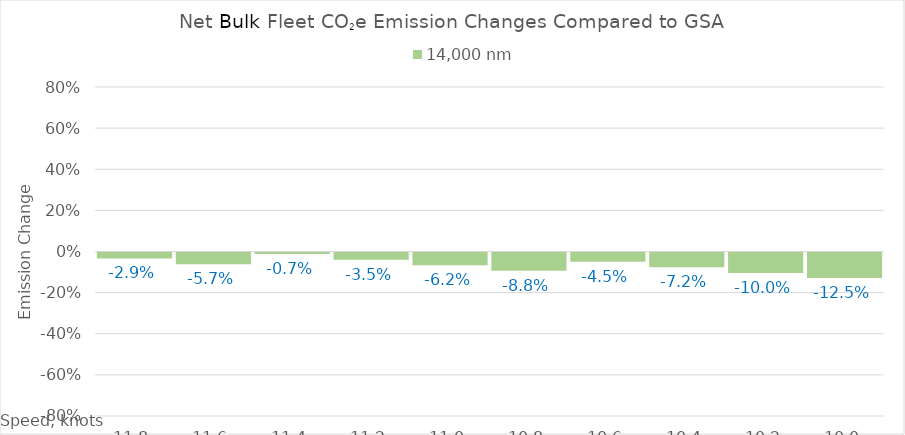
| Category | 14,000 |
|---|---|
| 11.8 | -0.029 |
| 11.600000000000001 | -0.057 |
| 11.400000000000002 | -0.007 |
| 11.200000000000003 | -0.035 |
| 11.000000000000004 | -0.062 |
| 10.800000000000004 | -0.088 |
| 10.600000000000005 | -0.045 |
| 10.400000000000006 | -0.072 |
| 10.200000000000006 | -0.1 |
| 10.000000000000007 | -0.125 |